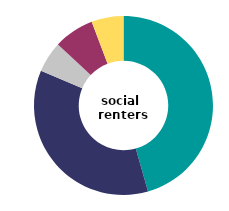
| Category | social 
renters |
|---|---|
| very 
satisfied | 45.585 |
| fairly
satisfied | 35.742 |
| neither satisfied 
nor dissatisfied | 5.589 |
| slightly 
dissatisfied | 7.303 |
| very
 dissatisfied | 5.781 |